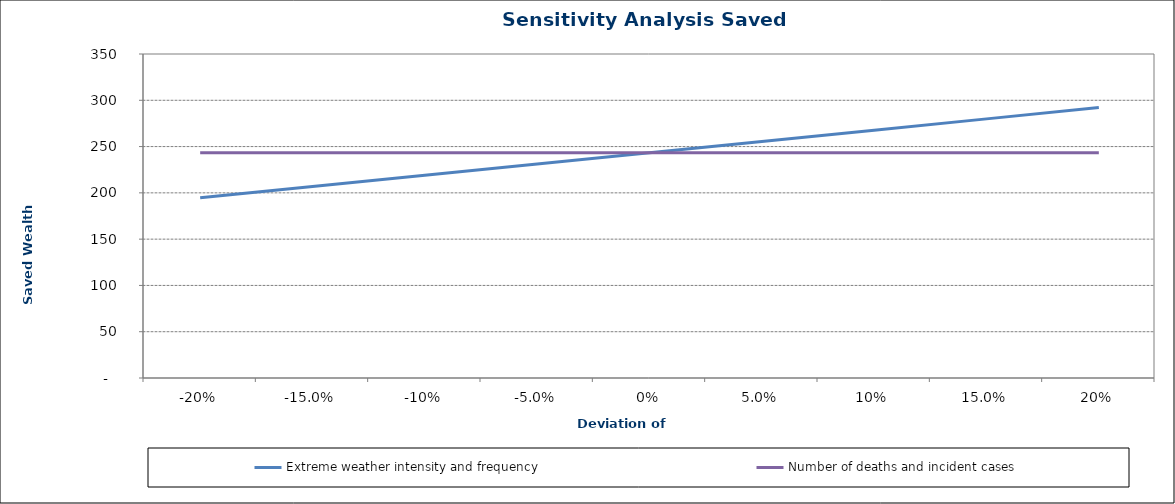
| Category | Extreme weather intensity and frequency | Number of deaths and incident cases |
|---|---|---|
| -0.2 | 194.73 | 243.412 |
| -0.15 | 206.901 | 243.412 |
| -0.1 | 219.071 | 243.412 |
| -0.05 | 231.242 | 243.412 |
| 0.0 | 243.412 | 243.412 |
| 0.05 | 255.583 | 243.412 |
| 0.1 | 267.754 | 243.412 |
| 0.15 | 279.924 | 243.412 |
| 0.2 | 292.095 | 243.412 |